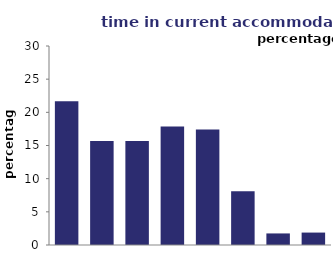
| Category | time in current accommodation |
|---|---|
| <1 
year | 21.659 |
| 1 
year | 15.673 |
| 2 
years | 15.673 |
| 3-4 
years | 17.851 |
| 5-9 
years | 17.426 |
| 10-19 
years | 8.101 |
| 20-29 
years | 1.743 |
| 30+ 
years | 1.873 |